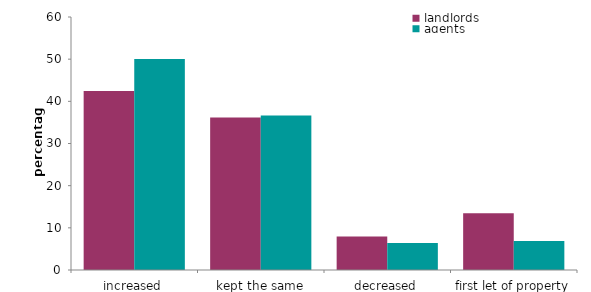
| Category | landlords | agents |
|---|---|---|
| increased | 42.457 | 50.061 |
| kept the same | 36.139 | 36.625 |
| decreased | 7.964 | 6.4 |
| first let of property | 13.44 | 6.896 |